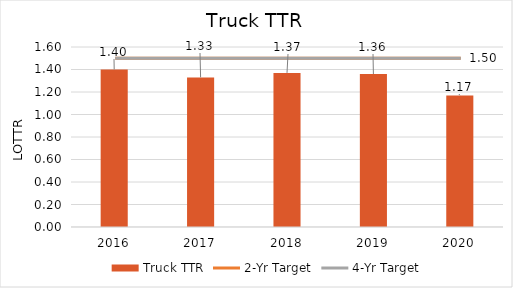
| Category | Truck TTR |
|---|---|
| 2016.0 | 1.4 |
| 2017.0 | 1.33 |
| 2018.0 | 1.37 |
| 2019.0 | 1.36 |
| 2020.0 | 1.17 |